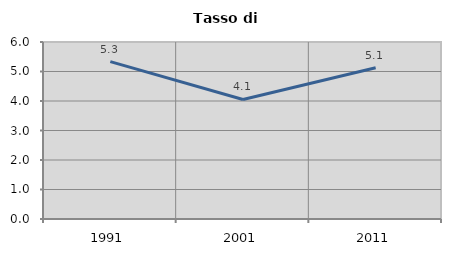
| Category | Tasso di disoccupazione   |
|---|---|
| 1991.0 | 5.333 |
| 2001.0 | 4.051 |
| 2011.0 | 5.128 |